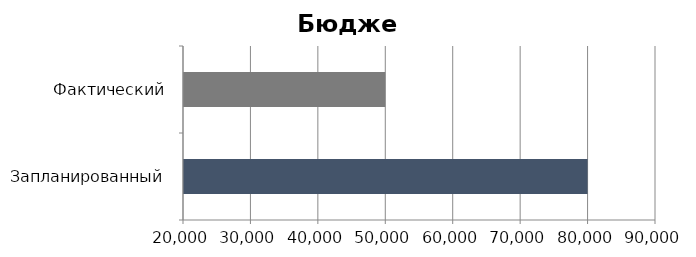
| Category | Series 0 |
|---|---|
| Запланированный | 80000 |
| Фактический | 50000 |